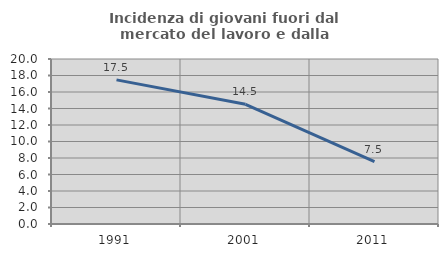
| Category | Incidenza di giovani fuori dal mercato del lavoro e dalla formazione  |
|---|---|
| 1991.0 | 17.472 |
| 2001.0 | 14.51 |
| 2011.0 | 7.547 |